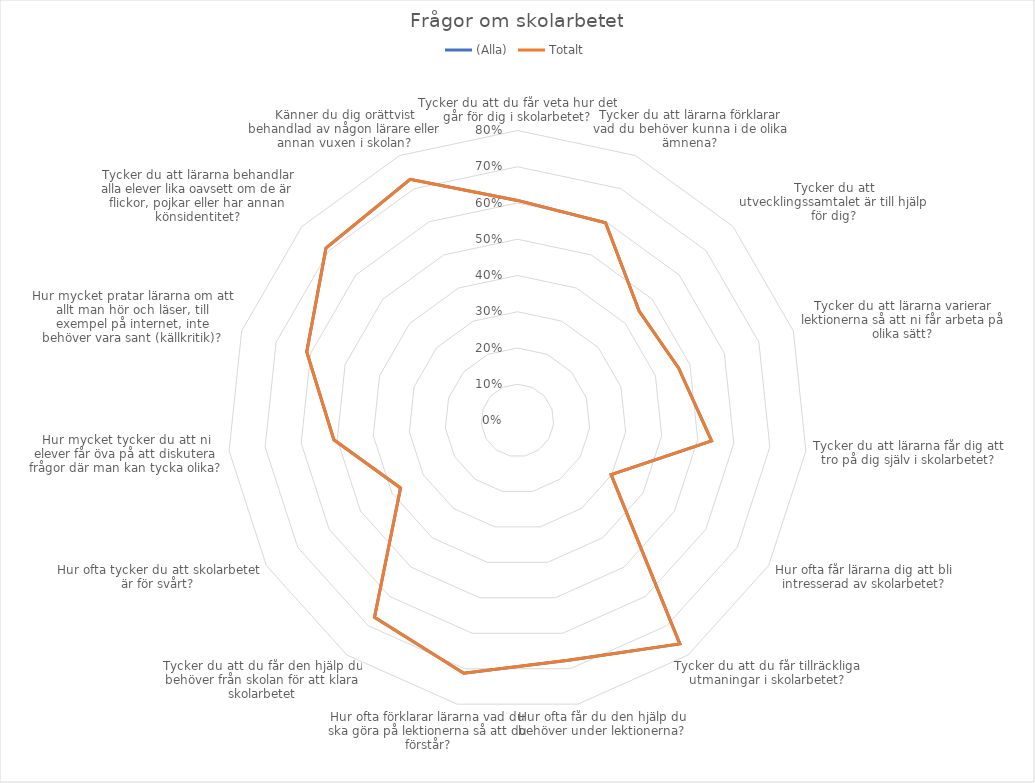
| Category | (Alla) | Totalt |
|---|---|---|
| Tycker du att du får veta hur det går för dig i skolarbetet? | 0.607 | 0.607 |
| Tycker du att lärarna förklarar vad du behöver kunna i de olika ämnena? | 0.597 | 0.597 |
| Tycker du att utvecklingssamtalet är till hjälp för dig? | 0.451 | 0.451 |
| Tycker du att lärarna varierar lektionerna så att ni får arbeta på olika sätt? | 0.468 | 0.468 |
| Tycker du att lärarna får dig att tro på dig själv i skolarbetet? | 0.538 | 0.538 |
| Hur ofta får lärarna dig att bli intresserad av skolarbetet? | 0.298 | 0.298 |
| Tycker du att du får tillräckliga utmaningar i skolarbetet? | 0.762 | 0.762 |
| Hur ofta får du den hjälp du behöver under lektionerna? | 0.676 | 0.676 |
| Hur ofta förklarar lärarna vad du ska göra på lektionerna så att du förstår? | 0.713 | 0.713 |
| Tycker du att du får den hjälp du behöver från skolan för att klara skolarbetet | 0.671 | 0.671 |
| Hur ofta tycker du att skolarbetet är för svårt? | 0.373 | 0.373 |
| Hur mycket tycker du att ni elever får öva på att diskutera frågor där man kan tycka olika? | 0.509 | 0.509 |
| Hur mycket pratar lärarna om att allt man hör och läser, till exempel på internet, inte behöver vara sant (källkritik)? | 0.611 | 0.611 |
| Tycker du att lärarna behandlar alla elever lika oavsett om de är flickor, pojkar eller har annan könsidentitet? | 0.711 | 0.711 |
| Känner du dig orättvist behandlad av någon lärare eller annan vuxen i skolan? | 0.728 | 0.728 |